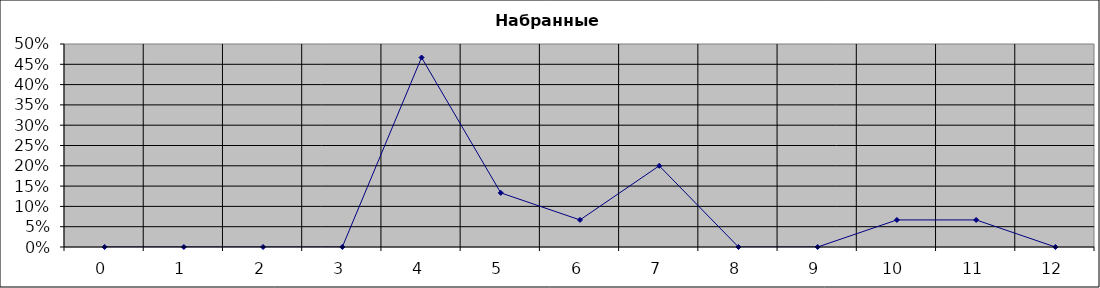
| Category | баллы |
|---|---|
| 0.0 | 0 |
| 1.0 | 0 |
| 2.0 | 0 |
| 3.0 | 0 |
| 4.0 | 0.467 |
| 5.0 | 0.133 |
| 6.0 | 0.067 |
| 7.0 | 0.2 |
| 8.0 | 0 |
| 9.0 | 0 |
| 10.0 | 0.067 |
| 11.0 | 0.067 |
| 12.0 | 0 |